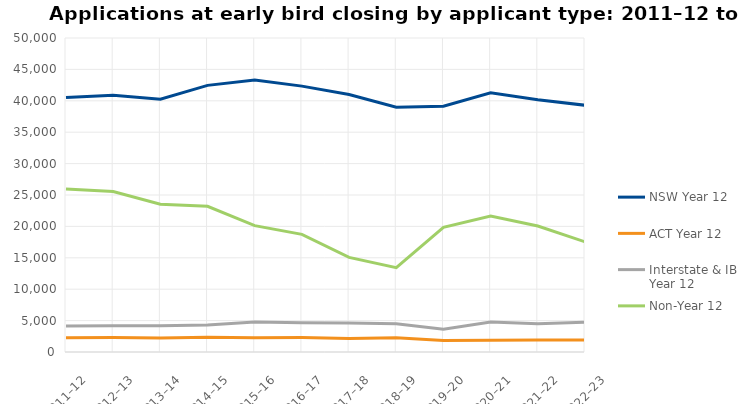
| Category | NSW Year 12 | ACT Year 12 | Interstate & IB Year 12 | Non-Year 12 |
|---|---|---|---|---|
| 2011–12 | 40535 | 2280 | 4137 | 25949 |
| 2012–13 | 40895 | 2308 | 4195 | 25567 |
| 2013–14 | 40264 | 2216 | 4168 | 23542 |
| 2014–15 | 42458 | 2365 | 4318 | 23202 |
| 2015–16 | 43303 | 2288 | 4783 | 20115 |
| 2016–17 | 42339 | 2306 | 4670 | 18727 |
| 2017–18 | 40989 | 2168 | 4599 | 15071 |
| 2018–19 | 38964 | 2263 | 4492 | 13424 |
| 2019–20 | 39132 | 1844 | 3620 | 19847 |
| 2020–21 | 41287 | 1874 | 4780 | 21661 |
| 2021–22 | 40154 | 1924 | 4491 | 20053 |
| 2022–23 | 39293 | 1911 | 4750 | 17542 |